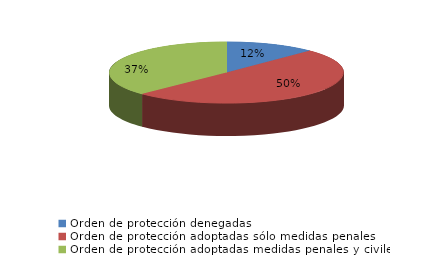
| Category | Series 0 |
|---|---|
| Orden de protección denegadas | 46 |
| Orden de protección adoptadas sólo medidas penales | 186 |
| Orden de protección adoptadas medidas penales y civiles | 138 |